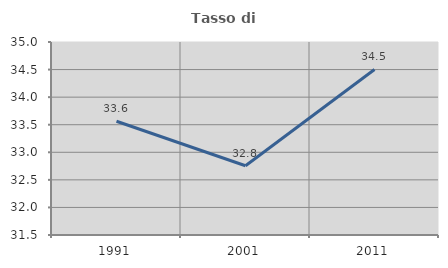
| Category | Tasso di occupazione   |
|---|---|
| 1991.0 | 33.563 |
| 2001.0 | 32.757 |
| 2011.0 | 34.502 |